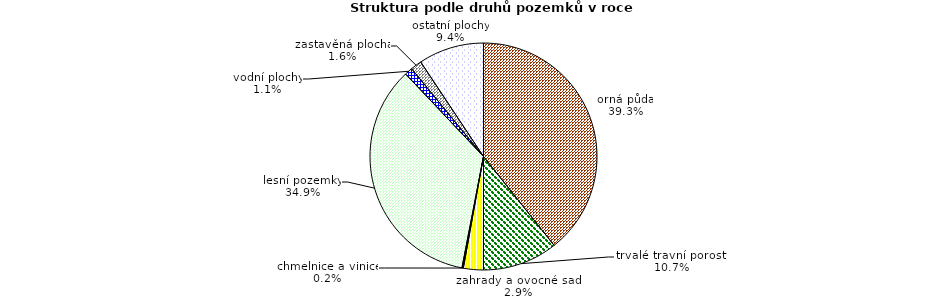
| Category | Struktura druhů pozemků |
|---|---|
| orná půda | 207036.009 |
| trvalé travní porosty | 56321.77 |
| zahrady a ovocné sady | 14960.036 |
| chmelnice a vinice | 1043.269 |
| lesní pozemky | 183854.902 |
| vodní plochy | 5901.685 |
| zastavěná plocha | 8378.356 |
| ostatní plochy | 49161.54 |